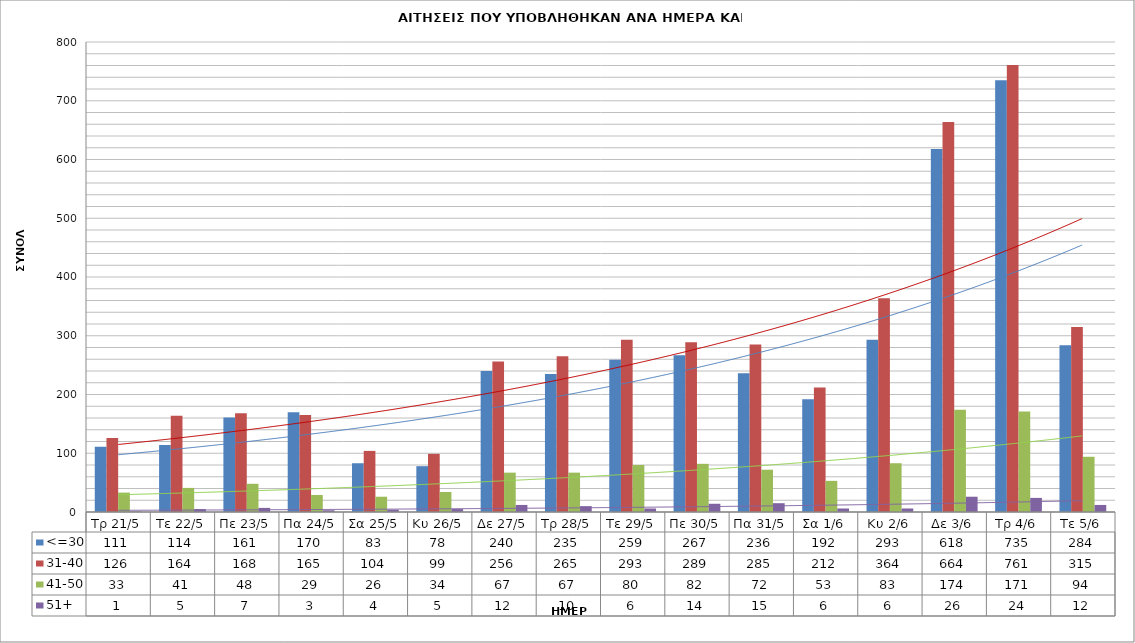
| Category | <=30 | 31-40 | 41-50 | 51+ |
|---|---|---|---|---|
| Τρ 21/5 | 111 | 126 | 33 | 1 |
| Τε 22/5 | 114 | 164 | 41 | 5 |
| Πε 23/5 | 161 | 168 | 48 | 7 |
| Πα 24/5 | 170 | 165 | 29 | 3 |
| Σα 25/5 | 83 | 104 | 26 | 4 |
| Κυ 26/5 | 78 | 99 | 34 | 5 |
| Δε 27/5 | 240 | 256 | 67 | 12 |
| Τρ 28/5 | 235 | 265 | 67 | 10 |
| Τε 29/5 | 259 | 293 | 80 | 6 |
| Πε 30/5 | 267 | 289 | 82 | 14 |
| Πα 31/5 | 236 | 285 | 72 | 15 |
| Σα 1/6 | 192 | 212 | 53 | 6 |
| Κυ 2/6 | 293 | 364 | 83 | 6 |
| Δε 3/6 | 618 | 664 | 174 | 26 |
| Τρ 4/6 | 735 | 761 | 171 | 24 |
| Τε 5/6 | 284 | 315 | 94 | 12 |